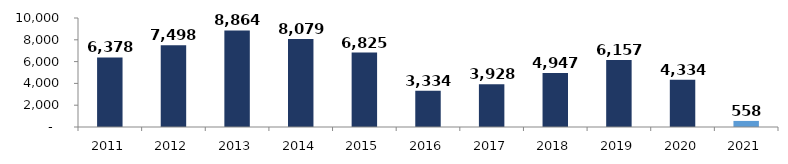
| Category | Series 0 |
|---|---|
| 2011.0 | 6377.615 |
| 2012.0 | 7498.207 |
| 2013.0 | 8863.622 |
| 2014.0 | 8079.21 |
| 2015.0 | 6824.624 |
| 2016.0 | 3333.564 |
| 2017.0 | 3928.017 |
| 2018.0 | 4947.435 |
| 2019.0 | 6157.132 |
| 2020.0 | 4333.656 |
| 2021.0 | 557.657 |